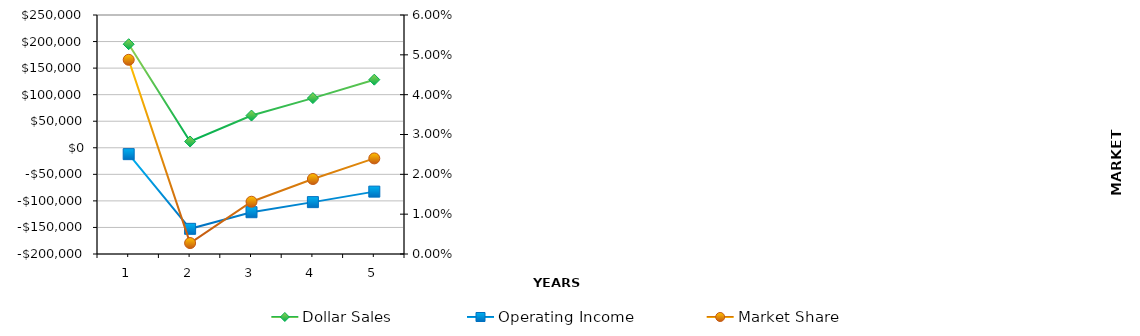
| Category | Dollar Sales | Operating Income |
|---|---|---|
| 0 | 195000 | -12000 |
| 1 | 11801.188 | -152607.015 |
| 2 | 60658.109 | -121321.815 |
| 3 | 93534.804 | -102333.409 |
| 4 | 128205.038 | -82569.255 |